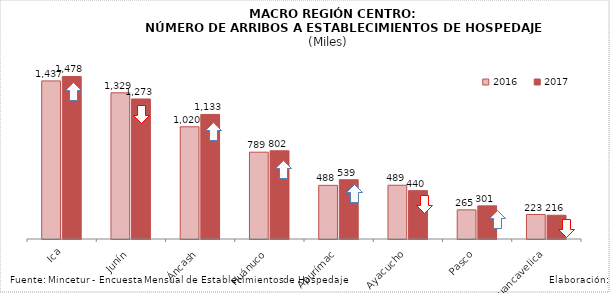
| Category | 2016 | 2017 |
|---|---|---|
| Ica | 1437.127 | 1477.841 |
| Junín | 1328.849 | 1272.902 |
| Áncash | 1020.109 | 1132.509 |
| Huánuco | 789.122 | 802.072 |
| Apurímac | 487.694 | 538.819 |
| Ayacucho | 488.745 | 439.545 |
| Pasco | 265.028 | 301.369 |
| Huancavelica | 222.66 | 215.867 |